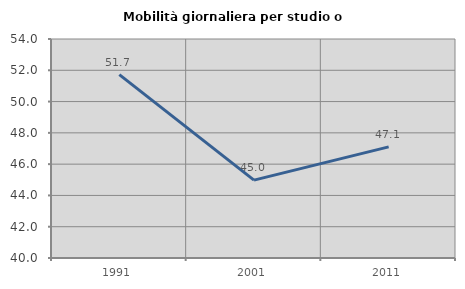
| Category | Mobilità giornaliera per studio o lavoro |
|---|---|
| 1991.0 | 51.72 |
| 2001.0 | 44.978 |
| 2011.0 | 47.102 |